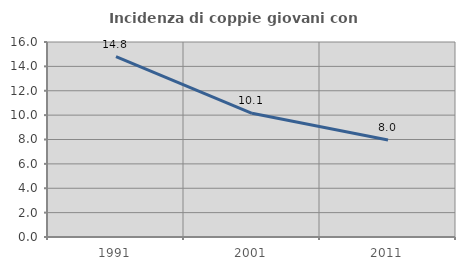
| Category | Incidenza di coppie giovani con figli |
|---|---|
| 1991.0 | 14.798 |
| 2001.0 | 10.147 |
| 2011.0 | 7.963 |